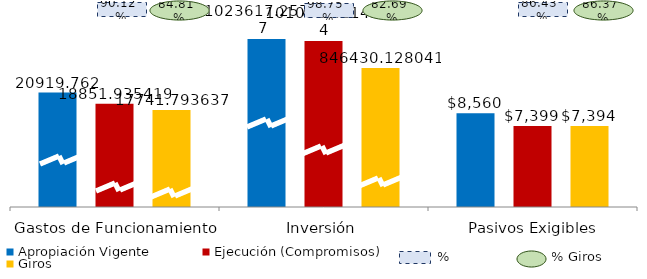
| Category | Apropiación Vigente | Ejecución (Compromisos) | Giros |
|---|---|---|---|
| Gastos de Funcionamiento | 10459.881 | 9425.968 | 8870.897 |
| Inversión | 15354.259 | 15162.213 | 12696.452 |
| Pasivos Exigibles | 8560.024 | 7398.813 | 7393.555 |